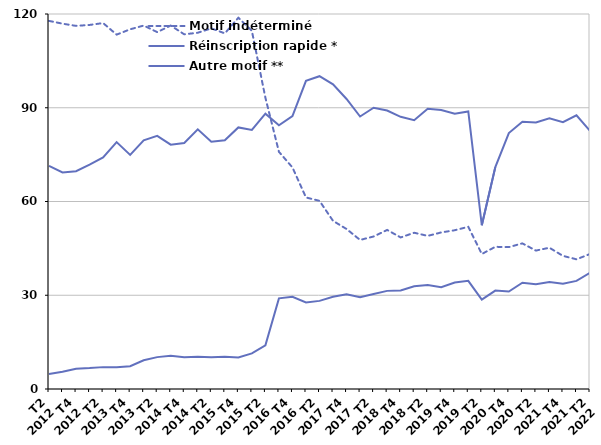
| Category | Motif indéterminé | Réinscription rapide * | Autre motif ** |
|---|---|---|---|
| T2
2012 | 117.8 | 71.4 | 4.8 |
| T3
2012 | 116.9 | 69.3 | 5.5 |
| T4
2012 | 116.2 | 69.7 | 6.5 |
| T1
2013 | 116.5 | 71.8 | 6.7 |
| T2
2013 | 117.1 | 74.1 | 7 |
| T3
2013 | 113.4 | 79 | 7 |
| T4
2013 | 115.1 | 74.9 | 7.3 |
| T1
2014 | 116.3 | 79.6 | 9.2 |
| T2
2014 | 114.2 | 81 | 10.2 |
| T3
2014 | 116.3 | 78.2 | 10.6 |
| T4
2014 | 113.5 | 78.7 | 10.2 |
| T1
2015 | 114 | 83.1 | 10.3 |
| T2
2015 | 115.4 | 79.1 | 10.2 |
| T3
2015 | 113.8 | 79.6 | 10.3 |
| T4
2015 | 118.8 | 83.7 | 10.1 |
| T1
2016 | 114.6 | 82.9 | 11.4 |
| T2
2016 | 93.2 | 88.1 | 14 |
| T3
2016 | 75.9 | 84.4 | 29 |
| T4
2016 | 70.9 | 87.3 | 29.5 |
| T1
2017 | 61.3 | 98.6 | 27.7 |
| T2
2017 | 60.2 | 100.1 | 28.2 |
| T3
2017 | 53.8 | 97.5 | 29.5 |
| T4
2017 | 51.2 | 92.8 | 30.3 |
| T1
2018 | 47.7 | 87.2 | 29.4 |
| T2
2018 | 48.8 | 90 | 30.4 |
| T3
2018 | 50.9 | 89.1 | 31.4 |
| T4
2018 | 48.5 | 87.1 | 31.5 |
| T1
2019 | 50 | 86 | 32.9 |
| T2
2019 | 49 | 89.7 | 33.3 |
| T3
2019 | 50.1 | 89.3 | 32.6 |
| T4
2019 | 50.8 | 88.1 | 34.1 |
| T1
2020 | 51.9 | 88.8 | 34.6 |
| T2
2020 | 43.2 | 52.4 | 28.6 |
| T3
2020 | 45.5 | 71 | 31.5 |
| T4
2020 | 45.4 | 81.9 | 31.2 |
| T1
2021 | 46.6 | 85.5 | 34 |
| T2
2021 | 44.3 | 85.3 | 33.5 |
| T3
2021 | 45.2 | 86.6 | 34.2 |
| T4
2021 | 42.6 | 85.4 | 33.7 |
| T1
2022 | 41.5 | 87.6 | 34.6 |
| T2
2022 | 43.2 | 82.6 | 37.2 |